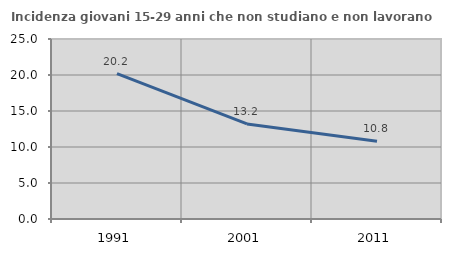
| Category | Incidenza giovani 15-29 anni che non studiano e non lavorano  |
|---|---|
| 1991.0 | 20.202 |
| 2001.0 | 13.208 |
| 2011.0 | 10.811 |